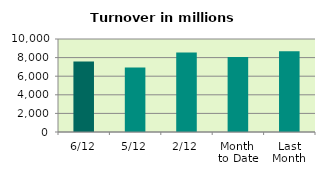
| Category | Series 0 |
|---|---|
| 6/12 | 7584.925 |
| 5/12 | 6934.867 |
| 2/12 | 8554.048 |
| Month 
to Date | 8062.047 |
| Last
Month | 8686.894 |